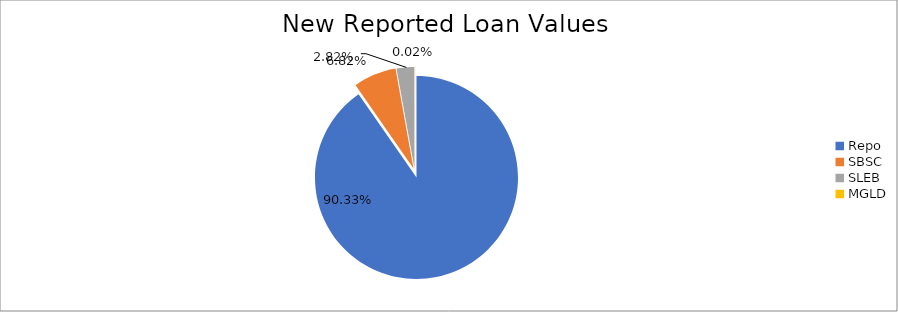
| Category | Series 0 |
|---|---|
| Repo | 12047375.505 |
| SBSC | 910176.797 |
| SLEB | 375987.452 |
| MGLD | 2831.462 |